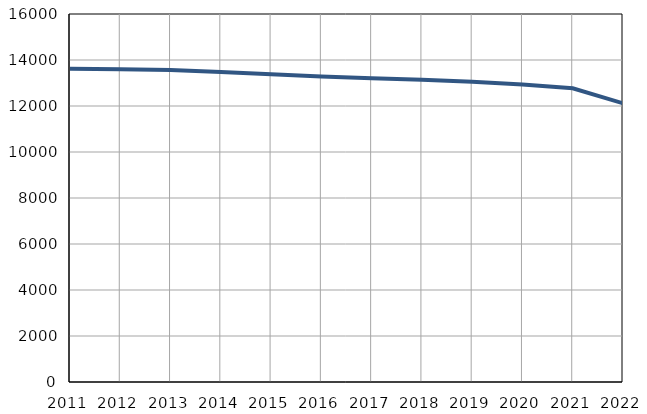
| Category | Број
становника |
|---|---|
| 2011.0 | 13622 |
| 2012.0 | 13600 |
| 2013.0 | 13566 |
| 2014.0 | 13478 |
| 2015.0 | 13379 |
| 2016.0 | 13285 |
| 2017.0 | 13205 |
| 2018.0 | 13141 |
| 2019.0 | 13057 |
| 2020.0 | 12939 |
| 2021.0 | 12772 |
| 2022.0 | 12117 |